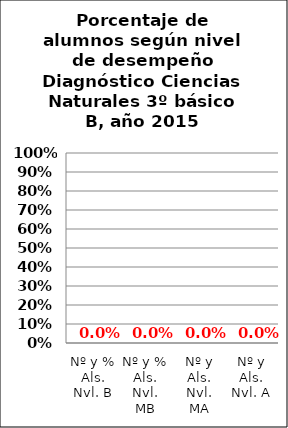
| Category | Series 0 | Series 1 | Series 2 | Series 3 |
|---|---|---|---|---|
| Nº y % Als. Nvl. B |  |  |  | 0 |
| Nº y % Als. Nvl. MB |  |  |  | 0 |
| Nº y Als. Nvl. MA |  |  |  | 0 |
| Nº y Als. Nvl. A |  |  |  | 0 |